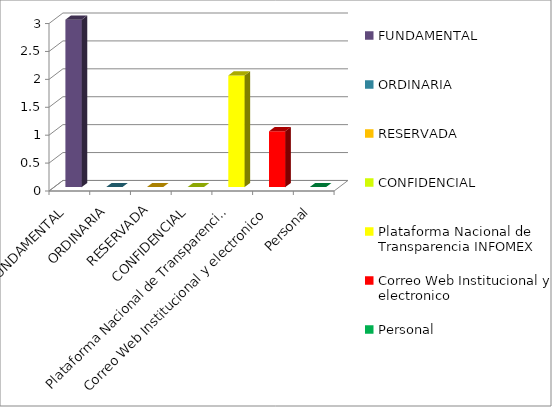
| Category | Series 2 |
|---|---|
| FUNDAMENTAL | 3 |
| ORDINARIA | 0 |
| RESERVADA | 0 |
| CONFIDENCIAL | 0 |
| Plataforma Nacional de Transparencia INFOMEX | 2 |
| Correo Web Institucional y electronico | 1 |
| Personal | 0 |